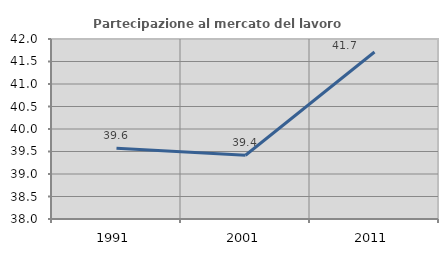
| Category | Partecipazione al mercato del lavoro  femminile |
|---|---|
| 1991.0 | 39.573 |
| 2001.0 | 39.416 |
| 2011.0 | 41.711 |